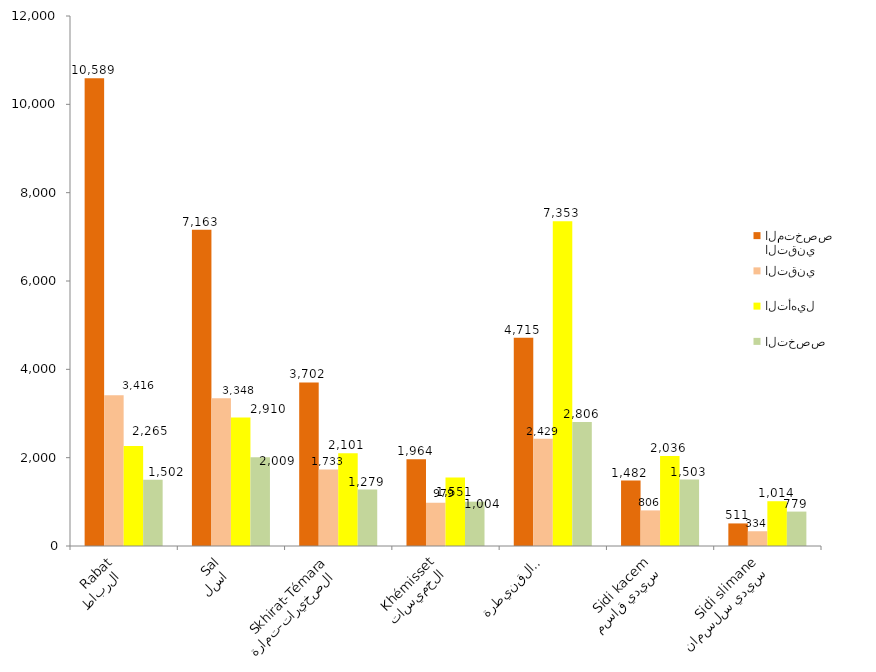
| Category | التقني المتخصص | التقني | التأهيل | التخصص     |
|---|---|---|---|---|
| الرباط 
Rabat | 10589 | 3416 | 2265 | 1502 |
| سلا 
 Salé | 7163 | 3348 | 2910 | 2009 |
| الصخيرات-تمارة 
Skhirat-Témara | 3702 | 1733 | 2101 | 1279 |
| الخميسات
Khémisset | 1964 | 979 | 1551 | 1004 |
| القنيطرة
kénitra | 4715 | 2429 | 7353 | 2806 |
| سيدي قاسم
Sidi kacem | 1482 | 806 | 2036 | 1503 |
| سيدي سلسمان
Sidi slimane | 511 | 334 | 1014 | 779 |